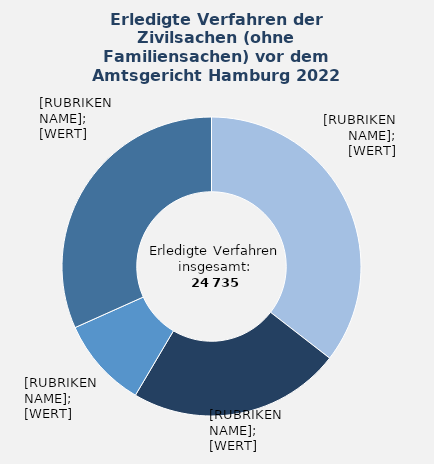
| Category | in Prozent |
|---|---|
| Sonstiger Verfahrensgegenstand | 35.5 |
| Wohnungsmietsachen | 23 |
| Verkehrsunfallsachen | 9.8 |
| Übrige Sachgebiete¹ | 31.7 |